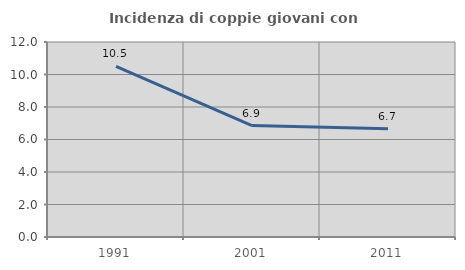
| Category | Incidenza di coppie giovani con figli |
|---|---|
| 1991.0 | 10.493 |
| 2001.0 | 6.857 |
| 2011.0 | 6.654 |